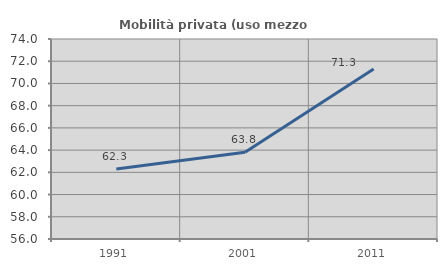
| Category | Mobilità privata (uso mezzo privato) |
|---|---|
| 1991.0 | 62.308 |
| 2001.0 | 63.81 |
| 2011.0 | 71.296 |